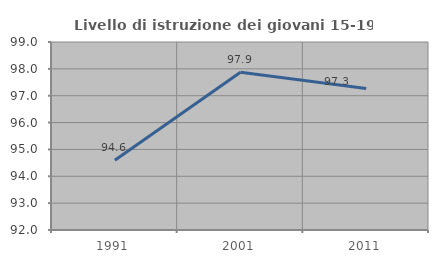
| Category | Livello di istruzione dei giovani 15-19 anni |
|---|---|
| 1991.0 | 94.595 |
| 2001.0 | 97.872 |
| 2011.0 | 97.273 |